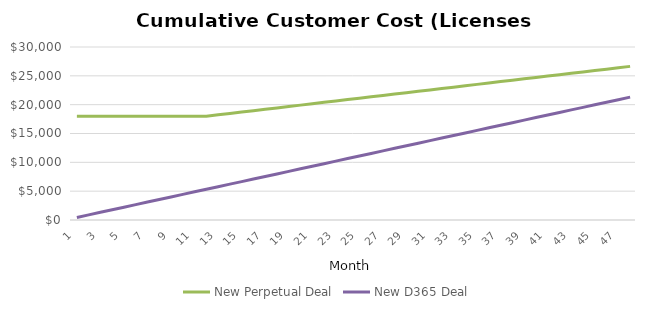
| Category | New Perpetual Deal | New D365 Deal |
|---|---|---|
| 1.0 | 18000 | 444 |
| 2.0 | 18000 | 888 |
| 3.0 | 18000 | 1332 |
| 4.0 | 18000 | 1776 |
| 5.0 | 18000 | 2220 |
| 6.0 | 18000 | 2664 |
| 7.0 | 18000 | 3108 |
| 8.0 | 18000 | 3552 |
| 9.0 | 18000 | 3996 |
| 10.0 | 18000 | 4440 |
| 11.0 | 18000 | 4884 |
| 12.0 | 18000 | 5328 |
| 13.0 | 18240 | 5772 |
| 14.0 | 18480 | 6216 |
| 15.0 | 18720 | 6660 |
| 16.0 | 18960 | 7104 |
| 17.0 | 19200 | 7548 |
| 18.0 | 19440 | 7992 |
| 19.0 | 19680 | 8436 |
| 20.0 | 19920 | 8880 |
| 21.0 | 20160 | 9324 |
| 22.0 | 20400 | 9768 |
| 23.0 | 20640 | 10212 |
| 24.0 | 20880 | 10656 |
| 25.0 | 21120 | 11100 |
| 26.0 | 21360 | 11544 |
| 27.0 | 21600 | 11988 |
| 28.0 | 21840 | 12432 |
| 29.0 | 22080 | 12876 |
| 30.0 | 22320 | 13320 |
| 31.0 | 22560 | 13764 |
| 32.0 | 22800 | 14208 |
| 33.0 | 23040 | 14652 |
| 34.0 | 23280 | 15096 |
| 35.0 | 23520 | 15540 |
| 36.0 | 23760 | 15984 |
| 37.0 | 24000 | 16428 |
| 38.0 | 24240 | 16872 |
| 39.0 | 24480 | 17316 |
| 40.0 | 24720 | 17760 |
| 41.0 | 24960 | 18204 |
| 42.0 | 25200 | 18648 |
| 43.0 | 25440 | 19092 |
| 44.0 | 25680 | 19536 |
| 45.0 | 25920 | 19980 |
| 46.0 | 26160 | 20424 |
| 47.0 | 26400 | 20868 |
| 48.0 | 26640 | 21312 |